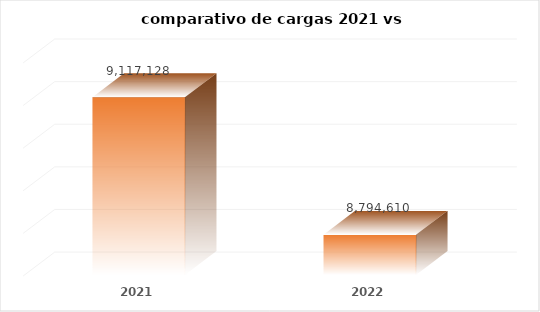
| Category | Series 1 |
|---|---|
| 2021.0 | 9117128 |
| 2022.0 | 8794610.43 |